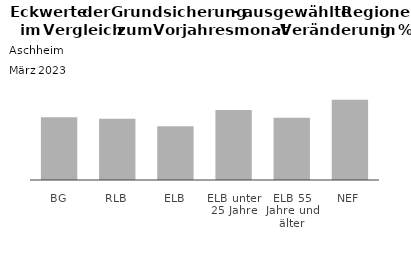
| Category | Series 0 |
|---|---|
| BG | 54.545 |
| RLB | 53.158 |
| ELB | 46.715 |
| ELB unter 25 Jahre | 60.87 |
| ELB 55 Jahre und älter | 54.167 |
| NEF | 69.811 |